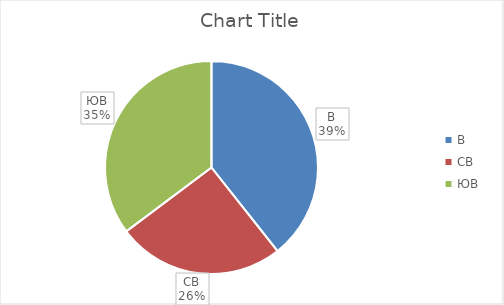
| Category | Series 0 |
|---|---|
| В | 48 |
| СВ | 31 |
| ЮВ | 43 |